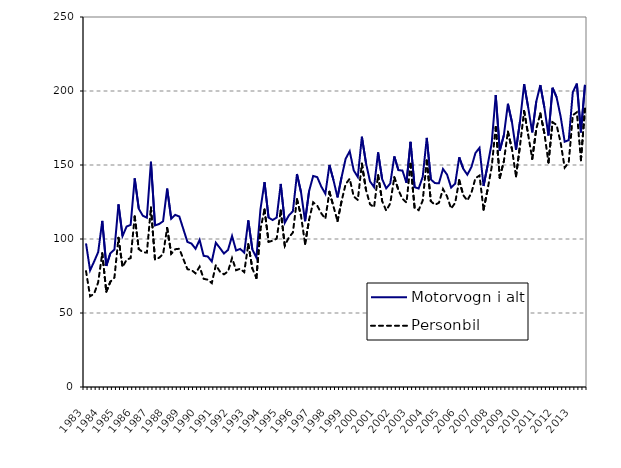
| Category | Motorvogn i alt | Personbil |
|---|---|---|
| 1983.0 | 97 | 78.3 |
| nan | 78.8 | 61.3 |
| nan | 84.8 | 63 |
| nan | 91.2 | 70.8 |
| 1984.0 | 112.2 | 90.4 |
| nan | 81.8 | 64.4 |
| nan | 90.4 | 71.1 |
| nan | 92.9 | 73.9 |
| 1985.0 | 123.4 | 100.8 |
| nan | 102 | 81.1 |
| nan | 108.4 | 86 |
| nan | 109.6 | 87.1 |
| 1986.0 | 141 | 115.2 |
| nan | 120.5 | 93.2 |
| nan | 115.7 | 91.1 |
| nan | 114.4 | 90.8 |
| 1987.0 | 152.2 | 121.3 |
| nan | 109.2 | 86.1 |
| nan | 110.1 | 87.3 |
| nan | 112 | 89.8 |
| 1988.0 | 134.1 | 107.5 |
| nan | 113.7 | 90 |
| nan | 116.3 | 93.1 |
| nan | 115.2 | 93.4 |
| 1989.0 | 106.6 | 86.4 |
| nan | 98 | 79.6 |
| nan | 96.9 | 79 |
| nan | 93.4 | 76.8 |
| 1990.0 | 99.4 | 81.3 |
| nan | 88.6 | 73.1 |
| nan | 88.2 | 72.5 |
| nan | 84.8 | 70.2 |
| 1991.0 | 97.5 | 82.4 |
| nan | 93.9 | 78 |
| nan | 90.2 | 76.1 |
| nan | 92.6 | 78.1 |
| 1992.0 | 102 | 87.1 |
| nan | 92.2 | 78.9 |
| nan | 93.3 | 79.9 |
| nan | 90.8 | 77.6 |
| 1993.0 | 112.6 | 96.5 |
| nan | 93 | 80.1 |
| nan | 87.5 | 73.6 |
| nan | 120.1 | 106.6 |
| 1994.0 | 138.4 | 120 |
| nan | 114.5 | 98.1 |
| nan | 112.8 | 98.8 |
| nan | 114.5 | 100.2 |
| 1995.0 | 137.2 | 119.3 |
| nan | 111 | 95.4 |
| nan | 115.9 | 101 |
| nan | 118.8 | 104.4 |
| 1996.0 | 143.9 | 126.9 |
| nan | 131.6 | 115.7 |
| nan | 112 | 96.7 |
| nan | 132.5 | 113.1 |
| 1997.0 | 142.6 | 124.8 |
| nan | 141.8 | 122.5 |
| nan | 135.4 | 117.3 |
| nan | 130.6 | 113.7 |
| 1998.0 | 150 | 131.9 |
| nan | 139.8 | 122 |
| nan | 128.1 | 112.1 |
| nan | 141.8 | 125.6 |
| 1999.0 | 154.2 | 137.1 |
| nan | 159.3 | 140.7 |
| nan | 146.3 | 128.7 |
| nan | 141.9 | 126.4 |
| 2000.0 | 169.1 | 150.9 |
| nan | 151.5 | 133.4 |
| nan | 139 | 123.5 |
| nan | 135.1 | 121.4 |
| 2001.0 | 158.5 | 143.1 |
| nan | 140.46 | 125.7 |
| nan | 134.24 | 119.2 |
| nan | 137.495 | 124.072 |
| 2002.0 | 155.814 | 141.724 |
| nan | 146.543 | 133.19 |
| nan | 146.231 | 127.141 |
| nan | 137.967 | 124.641 |
| 2003.0 | 165.679 | 150.811 |
| nan | 135.021 | 121.101 |
| nan | 134.111 | 119.491 |
| nan | 142.013 | 125.959 |
| 2004.0 | 168.309 | 153.043 |
| nan | 140.267 | 125.568 |
| nan | 137.77 | 123.121 |
| nan | 137.685 | 124.506 |
| 2005.0 | 147.311 | 133.756 |
| nan | 143.517 | 128.79 |
| nan | 134.783 | 120.571 |
| nan | 137.37 | 124.382 |
| 2006.0 | 155.213 | 139.728 |
| nan | 147.444 | 129.572 |
| nan | 143.451 | 126.006 |
| nan | 148.561 | 131.195 |
| 2007.0 | 158.1 | 141.084 |
| nan | 161.613 | 142.897 |
| nan | 135.821 | 119.753 |
| nan | 149.791 | 133.498 |
| 2008.0 | 164.642 | 148.614 |
| nan | 197.287 | 175.714 |
| nan | 159.718 | 141.407 |
| nan | 170.057 | 152.54 |
| 2009.0 | 191.38 | 172.559 |
| nan | 178.906 | 160.765 |
| nan | 160.234 | 142.312 |
| nan | 179.857 | 163.532 |
| 2010.0 | 204.636 | 186.507 |
| nan | 188.957 | 170.463 |
| nan | 172.077 | 154.156 |
| nan | 192.961 | 174.399 |
| 2011.0 | 204.005 | 184.86 |
| nan | 188.741 | 171.333 |
| nan | 169.934 | 151.694 |
| nan | 202.176 | 178.919 |
| 2012.0 | 195.829 | 177.072 |
| nan | 182.751 | 165.128 |
| nan | 165.73 | 148.242 |
| nan | 166.805 | 151.728 |
| 2013.0 | 199.181 | 183.653 |
| nan | 205.015 | 185.634 |
| nan | 172.044 | 153.21 |
| nan | 204.1 | 188.079 |